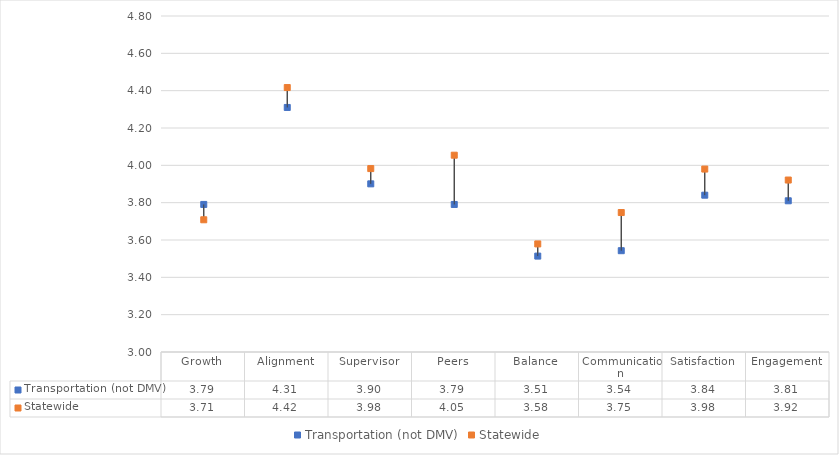
| Category | Transportation (not DMV) | Statewide |
|---|---|---|
| Growth | 3.791 | 3.708 |
| Alignment | 4.31 | 4.417 |
| Supervisor | 3.901 | 3.983 |
| Peers | 3.79 | 4.054 |
| Balance | 3.514 | 3.579 |
| Communication | 3.543 | 3.747 |
| Satisfaction | 3.84 | 3.98 |
| Engagement | 3.81 | 3.921 |